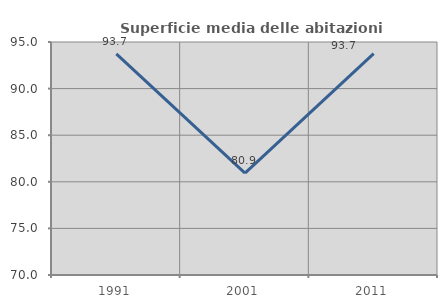
| Category | Superficie media delle abitazioni occupate |
|---|---|
| 1991.0 | 93.725 |
| 2001.0 | 80.94 |
| 2011.0 | 93.749 |